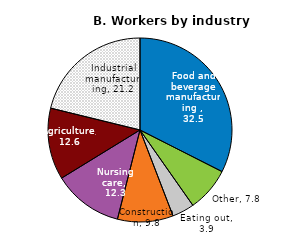
| Category | Series 0 |
|---|---|
| Food and beverage manufacturing  | 32.5 |
| Other | 7.8 |
| Eating out | 3.9 |
| Construction | 9.8 |
| Nursing care | 12.3 |
| Agriculture | 12.6 |
| Industrial manufacturing | 21.2 |